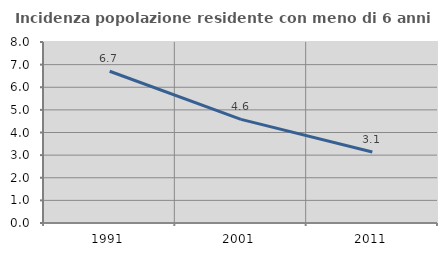
| Category | Incidenza popolazione residente con meno di 6 anni |
|---|---|
| 1991.0 | 6.707 |
| 2001.0 | 4.581 |
| 2011.0 | 3.14 |